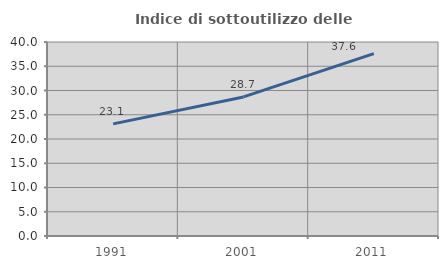
| Category | Indice di sottoutilizzo delle abitazioni  |
|---|---|
| 1991.0 | 23.124 |
| 2001.0 | 28.673 |
| 2011.0 | 37.601 |